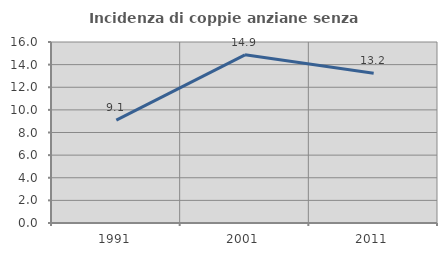
| Category | Incidenza di coppie anziane senza figli  |
|---|---|
| 1991.0 | 9.091 |
| 2001.0 | 14.865 |
| 2011.0 | 13.235 |